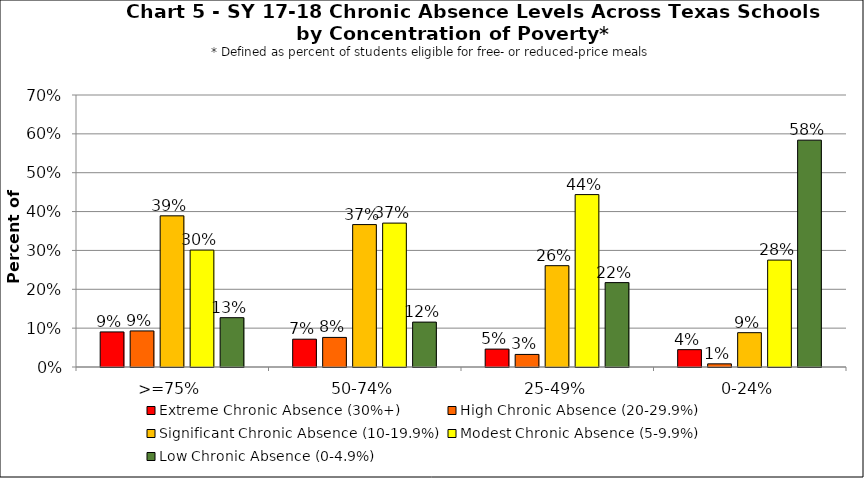
| Category | Extreme Chronic Absence (30%+) | High Chronic Absence (20-29.9%) | Significant Chronic Absence (10-19.9%) | Modest Chronic Absence (5-9.9%) | Low Chronic Absence (0-4.9%) |
|---|---|---|---|---|---|
| 0 | 0.09 | 0.093 | 0.389 | 0.301 | 0.127 |
| 1 | 0.072 | 0.076 | 0.366 | 0.37 | 0.116 |
| 2 | 0.046 | 0.032 | 0.261 | 0.444 | 0.217 |
| 3 | 0.045 | 0.008 | 0.088 | 0.275 | 0.584 |